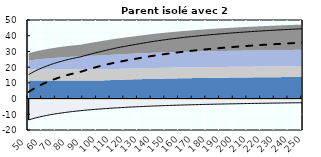
| Category | Coin fiscal moyen (somme des composantes) | Taux moyen d'imposition net en % du salaire brut |
|---|---|---|
| 50.0 | 15.244 | 4.226 |
| 51.0 | 15.759 | 4.807 |
| 52.0 | 16.254 | 5.367 |
| 53.0 | 16.73 | 5.905 |
| 54.0 | 17.189 | 6.424 |
| 55.0 | 17.631 | 6.923 |
| 56.0 | 18.058 | 7.405 |
| 57.0 | 18.469 | 7.87 |
| 58.0 | 18.866 | 8.319 |
| 59.0 | 19.25 | 8.752 |
| 60.0 | 19.621 | 9.171 |
| 61.0 | 19.979 | 9.577 |
| 62.0 | 20.327 | 9.969 |
| 63.0 | 20.663 | 10.349 |
| 64.0 | 20.988 | 10.717 |
| 65.0 | 21.304 | 11.074 |
| 66.0 | 21.61 | 11.419 |
| 67.0 | 21.907 | 11.755 |
| 68.0 | 22.195 | 12.081 |
| 69.0 | 22.475 | 12.397 |
| 70.0 | 22.747 | 12.704 |
| 71.0 | 23.011 | 13.003 |
| 72.0 | 23.268 | 13.293 |
| 73.0 | 23.518 | 13.575 |
| 74.0 | 23.761 | 13.85 |
| 75.0 | 23.997 | 14.117 |
| 76.0 | 24.228 | 14.377 |
| 77.0 | 24.452 | 14.631 |
| 78.0 | 24.671 | 14.878 |
| 79.0 | 24.884 | 15.119 |
| 80.0 | 25.092 | 15.353 |
| 81.0 | 25.294 | 15.582 |
| 82.0 | 25.492 | 15.806 |
| 83.0 | 25.685 | 16.024 |
| 84.0 | 25.873 | 16.237 |
| 85.0 | 26.057 | 16.444 |
| 86.0 | 26.237 | 16.647 |
| 87.0 | 26.412 | 16.846 |
| 88.0 | 26.584 | 17.04 |
| 89.0 | 26.812 | 17.298 |
| 90.0 | 27.069 | 17.588 |
| 91.0 | 27.32 | 17.871 |
| 92.0 | 27.565 | 18.149 |
| 93.0 | 27.806 | 18.42 |
| 94.0 | 28.041 | 18.686 |
| 95.0 | 28.271 | 18.946 |
| 96.0 | 28.496 | 19.201 |
| 97.0 | 28.717 | 19.45 |
| 98.0 | 28.934 | 19.695 |
| 99.0 | 29.145 | 19.934 |
| 100.0 | 29.353 | 20.169 |
| 101.0 | 29.557 | 20.399 |
| 102.0 | 29.756 | 20.624 |
| 103.0 | 29.952 | 20.846 |
| 104.0 | 30.172 | 21.062 |
| 105.0 | 30.389 | 21.275 |
| 106.0 | 30.602 | 21.484 |
| 107.0 | 30.811 | 21.689 |
| 108.0 | 31.015 | 21.89 |
| 109.0 | 31.216 | 22.087 |
| 110.0 | 31.413 | 22.281 |
| 111.0 | 31.607 | 22.471 |
| 112.0 | 31.796 | 22.658 |
| 113.0 | 31.983 | 22.842 |
| 114.0 | 32.166 | 23.022 |
| 115.0 | 32.345 | 23.199 |
| 116.0 | 32.522 | 23.373 |
| 117.0 | 32.695 | 23.544 |
| 118.0 | 32.865 | 23.713 |
| 119.0 | 33.032 | 23.878 |
| 120.0 | 33.197 | 24.041 |
| 121.0 | 33.358 | 24.201 |
| 122.0 | 33.517 | 24.358 |
| 123.0 | 33.673 | 24.513 |
| 124.0 | 33.826 | 24.665 |
| 125.0 | 33.977 | 24.815 |
| 126.0 | 34.126 | 24.963 |
| 127.0 | 34.272 | 25.108 |
| 128.0 | 34.429 | 25.266 |
| 129.0 | 34.59 | 25.43 |
| 130.0 | 34.749 | 25.591 |
| 131.0 | 34.906 | 25.75 |
| 132.0 | 35.06 | 25.906 |
| 133.0 | 35.212 | 26.06 |
| 134.0 | 35.361 | 26.212 |
| 135.0 | 35.508 | 26.362 |
| 136.0 | 35.653 | 26.509 |
| 137.0 | 35.796 | 26.654 |
| 138.0 | 35.936 | 26.797 |
| 139.0 | 36.075 | 26.938 |
| 140.0 | 36.211 | 27.077 |
| 141.0 | 36.346 | 27.214 |
| 142.0 | 36.478 | 27.349 |
| 143.0 | 36.609 | 27.483 |
| 144.0 | 36.737 | 27.614 |
| 145.0 | 36.864 | 27.744 |
| 146.0 | 36.989 | 27.871 |
| 147.0 | 37.112 | 27.997 |
| 148.0 | 37.234 | 28.122 |
| 149.0 | 37.354 | 28.244 |
| 150.0 | 37.472 | 28.365 |
| 151.0 | 37.589 | 28.485 |
| 152.0 | 37.704 | 28.603 |
| 153.0 | 37.817 | 28.719 |
| 154.0 | 37.929 | 28.834 |
| 155.0 | 38.04 | 28.947 |
| 156.0 | 38.149 | 29.059 |
| 157.0 | 38.257 | 29.169 |
| 158.0 | 38.363 | 29.279 |
| 159.0 | 38.468 | 29.386 |
| 160.0 | 38.571 | 29.493 |
| 161.0 | 38.673 | 29.598 |
| 162.0 | 38.774 | 29.701 |
| 163.0 | 38.874 | 29.804 |
| 164.0 | 38.972 | 29.905 |
| 165.0 | 39.069 | 30.005 |
| 166.0 | 39.165 | 30.104 |
| 167.0 | 39.26 | 30.201 |
| 168.0 | 39.354 | 30.298 |
| 169.0 | 39.446 | 30.393 |
| 170.0 | 39.538 | 30.487 |
| 171.0 | 39.628 | 30.58 |
| 172.0 | 39.717 | 30.672 |
| 173.0 | 39.805 | 30.763 |
| 174.0 | 39.892 | 30.853 |
| 175.0 | 39.978 | 30.942 |
| 176.0 | 40.063 | 31.03 |
| 177.0 | 40.147 | 31.116 |
| 178.0 | 40.23 | 31.202 |
| 179.0 | 40.313 | 31.287 |
| 180.0 | 40.394 | 31.371 |
| 181.0 | 40.474 | 31.454 |
| 182.0 | 40.553 | 31.536 |
| 183.0 | 40.632 | 31.618 |
| 184.0 | 40.71 | 31.698 |
| 185.0 | 40.786 | 31.777 |
| 186.0 | 40.862 | 31.856 |
| 187.0 | 40.937 | 31.934 |
| 188.0 | 41.012 | 32.011 |
| 189.0 | 41.085 | 32.087 |
| 190.0 | 41.158 | 32.162 |
| 191.0 | 41.23 | 32.237 |
| 192.0 | 41.301 | 32.31 |
| 193.0 | 41.371 | 32.383 |
| 194.0 | 41.441 | 32.456 |
| 195.0 | 41.51 | 32.527 |
| 196.0 | 41.578 | 32.598 |
| 197.0 | 41.645 | 32.668 |
| 198.0 | 41.712 | 32.737 |
| 199.0 | 41.778 | 32.806 |
| 200.0 | 41.844 | 32.874 |
| 201.0 | 41.908 | 32.941 |
| 202.0 | 41.973 | 33.008 |
| 203.0 | 42.036 | 33.074 |
| 204.0 | 42.099 | 33.139 |
| 205.0 | 42.161 | 33.204 |
| 206.0 | 42.223 | 33.268 |
| 207.0 | 42.284 | 33.331 |
| 208.0 | 42.344 | 33.394 |
| 209.0 | 42.404 | 33.456 |
| 210.0 | 42.463 | 33.518 |
| 211.0 | 42.521 | 33.579 |
| 212.0 | 42.58 | 33.64 |
| 213.0 | 42.637 | 33.7 |
| 214.0 | 42.694 | 33.759 |
| 215.0 | 42.75 | 33.818 |
| 216.0 | 42.806 | 33.876 |
| 217.0 | 42.862 | 33.934 |
| 218.0 | 42.916 | 33.991 |
| 219.0 | 42.971 | 34.048 |
| 220.0 | 43.025 | 34.104 |
| 221.0 | 43.078 | 34.159 |
| 222.0 | 43.131 | 34.214 |
| 223.0 | 43.183 | 34.269 |
| 224.0 | 43.235 | 34.323 |
| 225.0 | 43.286 | 34.377 |
| 226.0 | 43.337 | 34.43 |
| 227.0 | 43.388 | 34.483 |
| 228.0 | 43.438 | 34.535 |
| 229.0 | 43.487 | 34.587 |
| 230.0 | 43.537 | 34.638 |
| 231.0 | 43.585 | 34.689 |
| 232.0 | 43.634 | 34.74 |
| 233.0 | 43.681 | 34.79 |
| 234.0 | 43.729 | 34.839 |
| 235.0 | 43.776 | 34.889 |
| 236.0 | 43.823 | 34.937 |
| 237.0 | 43.869 | 34.986 |
| 238.0 | 43.915 | 35.034 |
| 239.0 | 43.96 | 35.081 |
| 240.0 | 44.005 | 35.128 |
| 241.0 | 44.05 | 35.175 |
| 242.0 | 44.094 | 35.222 |
| 243.0 | 44.138 | 35.268 |
| 244.0 | 44.182 | 35.313 |
| 245.0 | 44.225 | 35.358 |
| 246.0 | 44.268 | 35.403 |
| 247.0 | 44.31 | 35.448 |
| 248.0 | 44.352 | 35.492 |
| 249.0 | 44.394 | 35.536 |
| 250.0 | 44.435 | 35.579 |